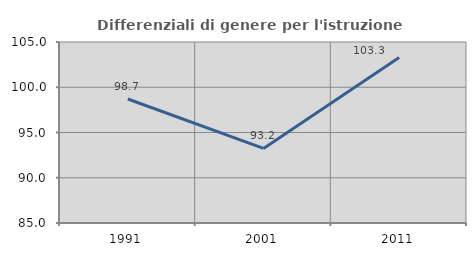
| Category | Differenziali di genere per l'istruzione superiore |
|---|---|
| 1991.0 | 98.703 |
| 2001.0 | 93.245 |
| 2011.0 | 103.287 |